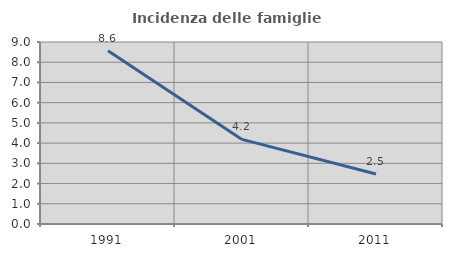
| Category | Incidenza delle famiglie numerose |
|---|---|
| 1991.0 | 8.566 |
| 2001.0 | 4.183 |
| 2011.0 | 2.473 |